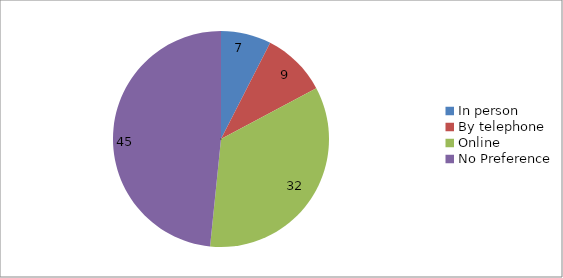
| Category | Series 0 | Series 1 |
|---|---|---|
| In person | 7 |  |
| By telephone | 9 |  |
| Online | 32 |  |
| No Preference | 45 |  |